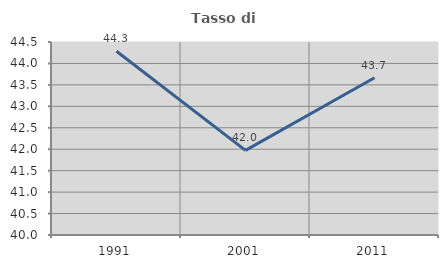
| Category | Tasso di occupazione   |
|---|---|
| 1991.0 | 44.286 |
| 2001.0 | 41.972 |
| 2011.0 | 43.666 |